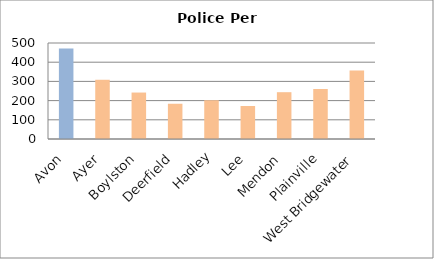
| Category | Series 0 |
|---|---|
| Avon | 471.85 |
| Ayer | 308.496 |
| Boylston | 241.932 |
| Deerfield | 183.569 |
| Hadley | 201.852 |
| Lee | 171.874 |
| Mendon | 243.786 |
| Plainville | 260.457 |
| West Bridgewater | 356.522 |